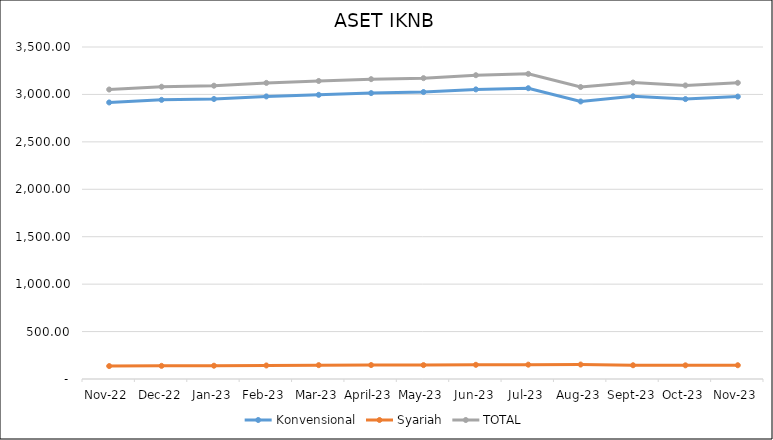
| Category |  Konvensional  |  Syariah  | TOTAL |
|---|---|---|---|
| Nov-22 | 2915.393 | 136.376 | 3051.769 |
| Dec-22 | 2942.716 | 138.533 | 3081.249 |
| Jan-23 | 2951.832 | 140.165 | 3091.997 |
| Feb-23 | 2978.913 | 142.696 | 3121.609 |
| Mar-23 | 2995.706 | 146.066 | 3141.772 |
| April-23 | 3013.962 | 147.013 | 3160.975 |
| May-23 | 3025.142 | 146.46 | 3171.602 |
| Jun-23 | 3053.172 | 149.576 | 3202.747 |
| Jul-23 | 3065.53 | 151.21 | 3216.74 |
| Aug-23 | 2925.63 | 152.49 | 3078.12 |
| Sep-23 | 2980.284 | 144.946 | 3125.23 |
| Oct-23 | 2950.911 | 144.2 | 3095.111 |
| Nov-23 | 2977.349 | 145.12 | 3122.469 |